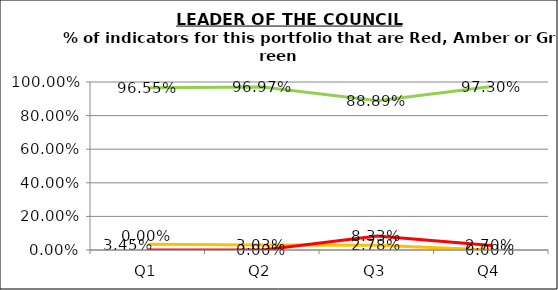
| Category | Green | Amber | Red |
|---|---|---|---|
| Q1 | 0.966 | 0.034 | 0 |
| Q2 | 0.97 | 0.03 | 0 |
| Q3 | 0.889 | 0.028 | 0.083 |
| Q4 | 0.973 | 0 | 0.027 |